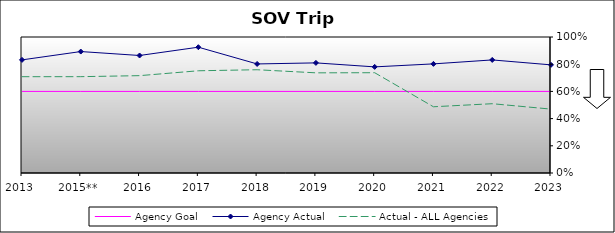
| Category | Agency Goal | Agency Actual | Actual - ALL Agencies |
|---|---|---|---|
| 2013 | 0.6 | 0.832 | 0.708 |
| 2015** | 0.6 | 0.893 | 0.708 |
| 2016 | 0.6 | 0.864 | 0.716 |
| 2017 | 0.6 | 0.925 | 0.752 |
| 2018 | 0.6 | 0.802 | 0.759 |
| 2019 | 0.6 | 0.81 | 0.736 |
| 2020 | 0.6 | 0.78 | 0.737 |
| 2021 | 0.6 | 0.802 | 0.487 |
| 2022 | 0.6 | 0.831 | 0.509 |
| 2023 | 0.6 | 0.795 | 0.47 |